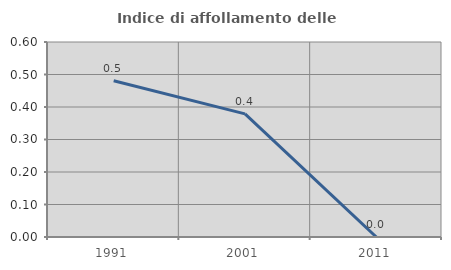
| Category | Indice di affollamento delle abitazioni  |
|---|---|
| 1991.0 | 0.481 |
| 2001.0 | 0.379 |
| 2011.0 | 0 |